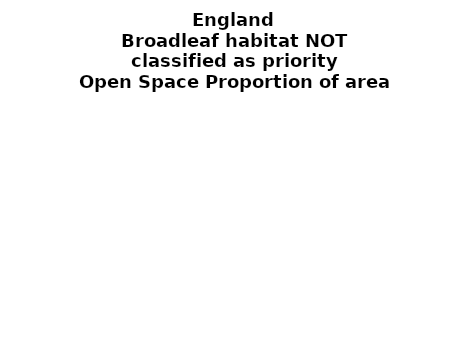
| Category | Broadleaf habitat NOT classified as priority |
|---|---|
|  ≥ 10ha, < 10%  | 0.209 |
|   ≥ 10ha, 10-25% | 0.107 |
|   ≥ 10ha, > 25 and <50%  | 0.127 |
|   ≥ 10ha, ≥ 50%  | 0.19 |
|  < 10ha, < 10% | 0.016 |
|  < 10ha, 10-25% | 0.028 |
|  < 10ha, > 25 and < 50% | 0.062 |
|  < 10ha, ≥ 50% | 0.262 |